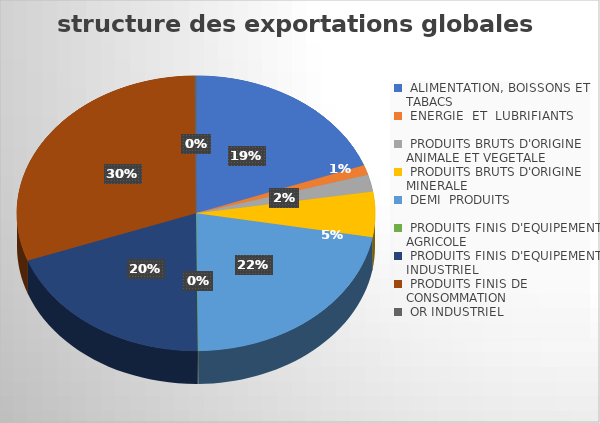
| Category | Series 0 |
|---|---|
| ALIMENTATION, BOISSONS ET TABACS | 53146047319.175 |
| ENERGIE  ET  LUBRIFIANTS | 3209075026.508 |
| PRODUITS BRUTS D'ORIGINE ANIMALE ET VEGETALE | 5475353945.466 |
| PRODUITS BRUTS D'ORIGINE MINERALE | 14687468834.971 |
| DEMI  PRODUITS | 60628572188.641 |
| PRODUITS FINIS D'EQUIPEMENT AGRICOLE | 151464948.746 |
| PRODUITS FINIS D'EQUIPEMENT INDUSTRIEL | 53875473262.04 |
| PRODUITS FINIS DE CONSOMMATION | 83890483095.121 |
| OR INDUSTRIEL  | 376594548.82 |